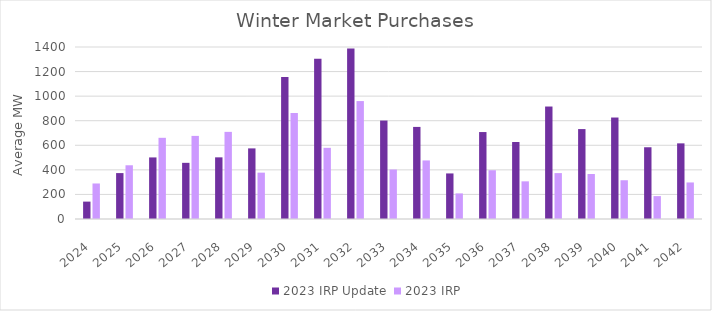
| Category | 2023 IRP Update | 2023 IRP |
|---|---|---|
| 2024.0 | 141.505 | 289.12 |
| 2025.0 | 373.696 | 437.312 |
| 2026.0 | 501.183 | 660.793 |
| 2027.0 | 457.184 | 676.438 |
| 2028.0 | 501.882 | 709.227 |
| 2029.0 | 574.745 | 377.339 |
| 2030.0 | 1155.598 | 862.708 |
| 2031.0 | 1304.953 | 579.254 |
| 2032.0 | 1387.077 | 959.913 |
| 2033.0 | 801.277 | 402.937 |
| 2034.0 | 749.483 | 476.734 |
| 2035.0 | 370.907 | 208.28 |
| 2036.0 | 707.728 | 396.767 |
| 2037.0 | 626.539 | 306.532 |
| 2038.0 | 915.497 | 373.642 |
| 2039.0 | 731.895 | 366.136 |
| 2040.0 | 825.981 | 315.43 |
| 2041.0 | 583.992 | 186.257 |
| 2042.0 | 615.712 | 297.5 |